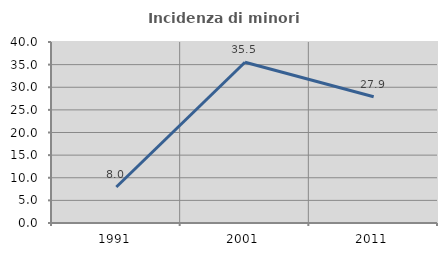
| Category | Incidenza di minori stranieri |
|---|---|
| 1991.0 | 7.955 |
| 2001.0 | 35.524 |
| 2011.0 | 27.904 |